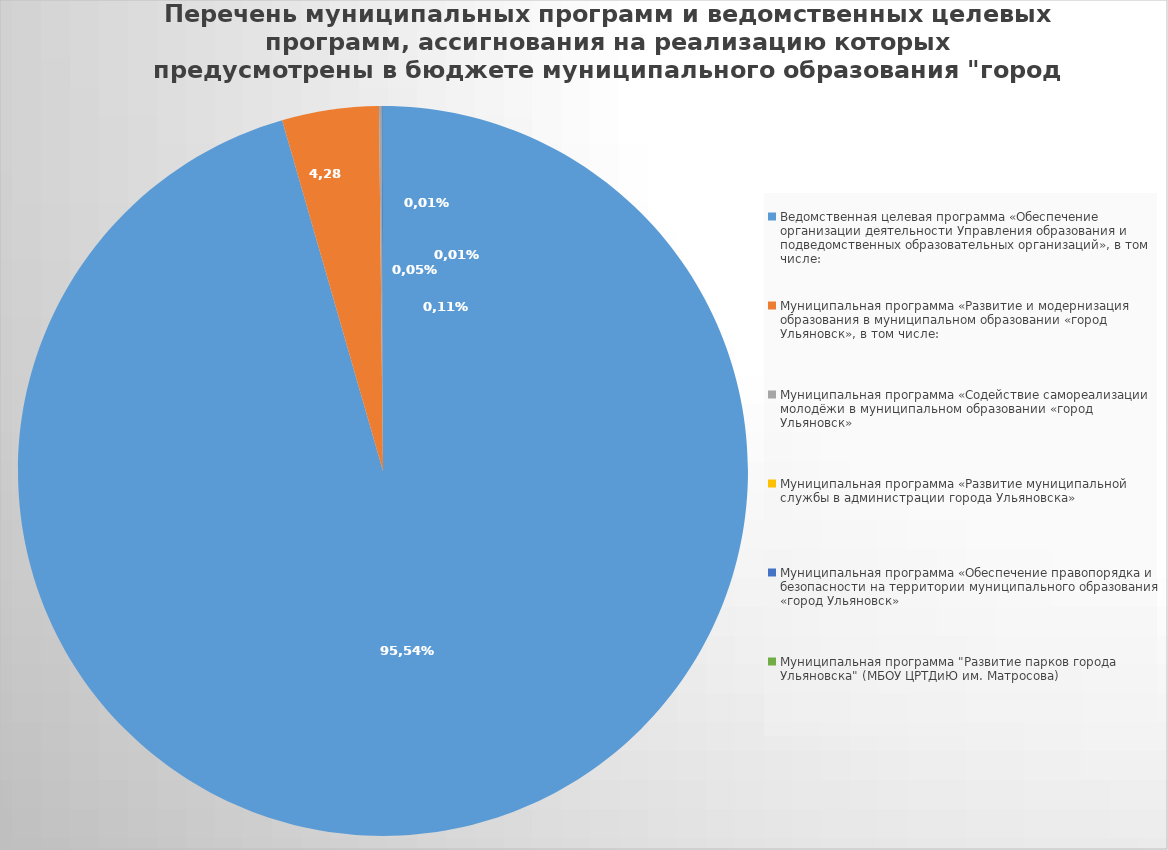
| Category | Series 0 |
|---|---|
| Ведомственная целевая программа «Обеспечение организации деятельности Управления образования и подведомственных образовательных организаций», в том числе: | 4495890.6 |
| Муниципальная программа «Развитие и модернизация образования в муниципальном образовании «город Ульяновск», в том числе: | 201449.7 |
| Муниципальная программа «Содействие самореализации молодёжи в муниципальном образовании «город Ульяновск» | 5254.4 |
| Муниципальная программа «Развитие муниципальной службы в администрации города Ульяновска» | 15.4 |
| Муниципальная программа «Обеспечение правопорядка и безопасности на территории муниципального образования «город Ульяновск» | 2565 |
| Муниципальная программа "Развитие парков города Ульяновска" (МБОУ ЦРТДиЮ им. Матросова) | 400 |